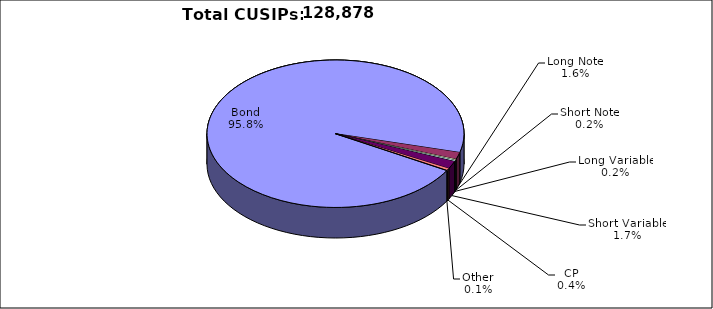
| Category | CUSIPs |
|---|---|
| Bond | 123410 |
| Long Note | 2008 |
| Short Note | 293 |
| Long Variable | 321 |
| Short Variable | 2197 |
| CP | 579 |
| Other | 70 |